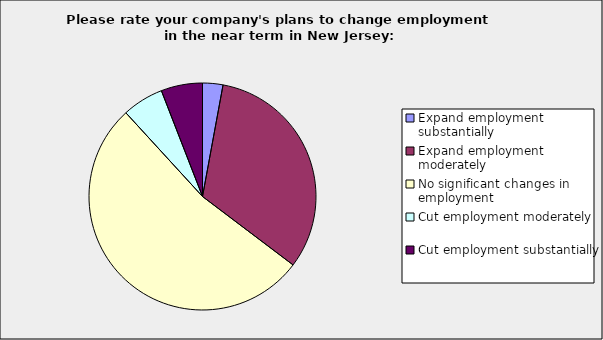
| Category | Series 0 |
|---|---|
| Expand employment substantially | 0.029 |
| Expand employment moderately | 0.324 |
| No significant changes in employment | 0.529 |
| Cut employment moderately | 0.059 |
| Cut employment substantially | 0.059 |